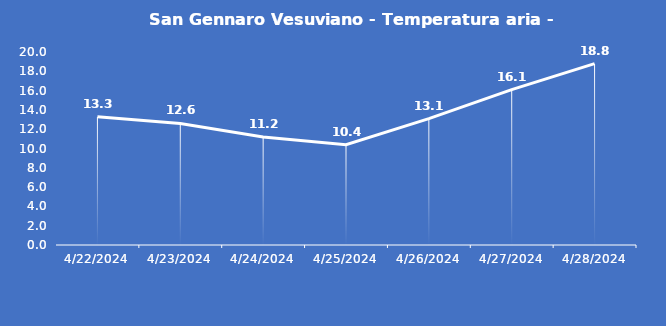
| Category | San Gennaro Vesuviano - Temperatura aria - Grezzo (°C) |
|---|---|
| 4/22/24 | 13.3 |
| 4/23/24 | 12.6 |
| 4/24/24 | 11.2 |
| 4/25/24 | 10.4 |
| 4/26/24 | 13.1 |
| 4/27/24 | 16.1 |
| 4/28/24 | 18.8 |